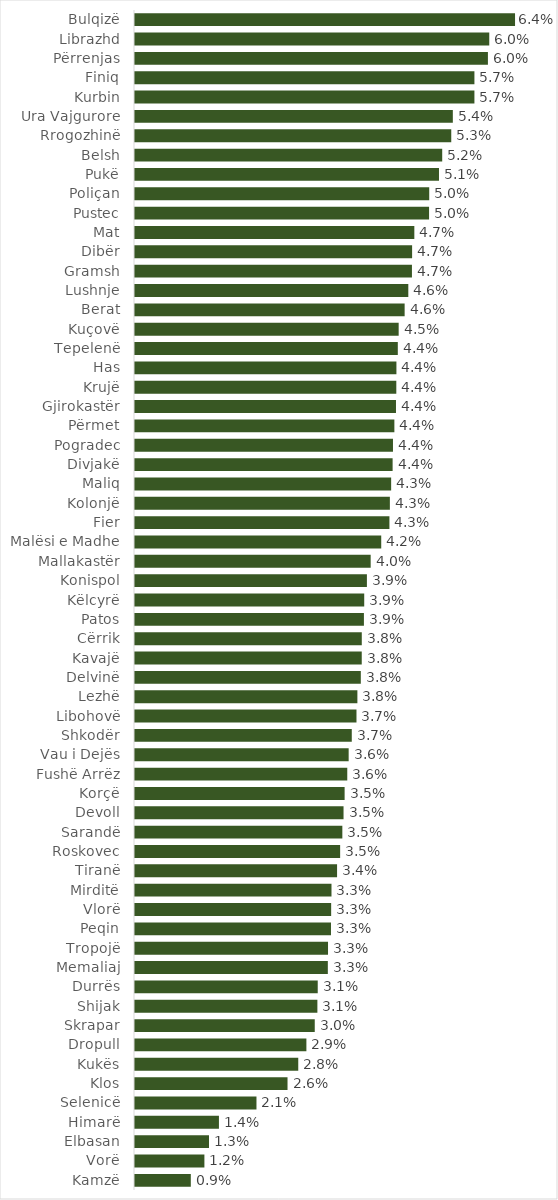
| Category | Pavlefshmëria në % |
|---|---|
| Bulqizë | 0.064 |
| Librazhd | 0.06 |
| Përrenjas | 0.06 |
| Finiq | 0.057 |
| Kurbin | 0.057 |
| Ura Vajgurore | 0.054 |
| Rrogozhinë | 0.053 |
| Belsh | 0.052 |
| Pukë | 0.051 |
| Poliçan | 0.05 |
| Pustec | 0.05 |
| Mat | 0.047 |
| Dibër | 0.047 |
| Gramsh | 0.047 |
| Lushnje | 0.046 |
| Berat | 0.046 |
| Kuçovë | 0.045 |
| Tepelenë | 0.044 |
| Has | 0.044 |
| Krujë | 0.044 |
| Gjirokastër | 0.044 |
| Përmet | 0.044 |
| Pogradec | 0.044 |
| Divjakë | 0.044 |
| Maliq | 0.043 |
| Kolonjë | 0.043 |
| Fier | 0.043 |
| Malësi e Madhe | 0.042 |
| Mallakastër | 0.04 |
| Konispol | 0.039 |
| Këlcyrë | 0.039 |
| Patos | 0.039 |
| Cërrik | 0.038 |
| Kavajë | 0.038 |
| Delvinë | 0.038 |
| Lezhë | 0.038 |
| Libohovë | 0.037 |
| Shkodër | 0.037 |
| Vau i Dejës | 0.036 |
| Fushë Arrëz | 0.036 |
| Korçë | 0.035 |
| Devoll | 0.035 |
| Sarandë | 0.035 |
| Roskovec | 0.035 |
| Tiranë | 0.034 |
| Mirditë | 0.033 |
| Vlorë | 0.033 |
| Peqin | 0.033 |
| Tropojë | 0.033 |
| Memaliaj | 0.033 |
| Durrës | 0.031 |
| Shijak | 0.031 |
| Skrapar | 0.03 |
| Dropull | 0.029 |
| Kukës | 0.028 |
| Klos | 0.026 |
| Selenicë | 0.021 |
| Himarë | 0.014 |
| Elbasan | 0.013 |
| Vorë | 0.012 |
| Kamzë | 0.009 |